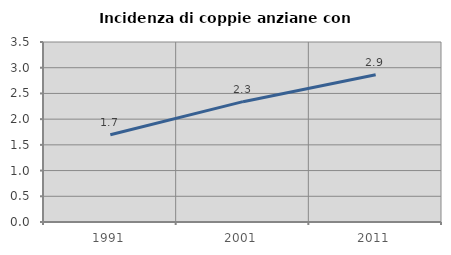
| Category | Incidenza di coppie anziane con figli |
|---|---|
| 1991.0 | 1.696 |
| 2001.0 | 2.34 |
| 2011.0 | 2.863 |